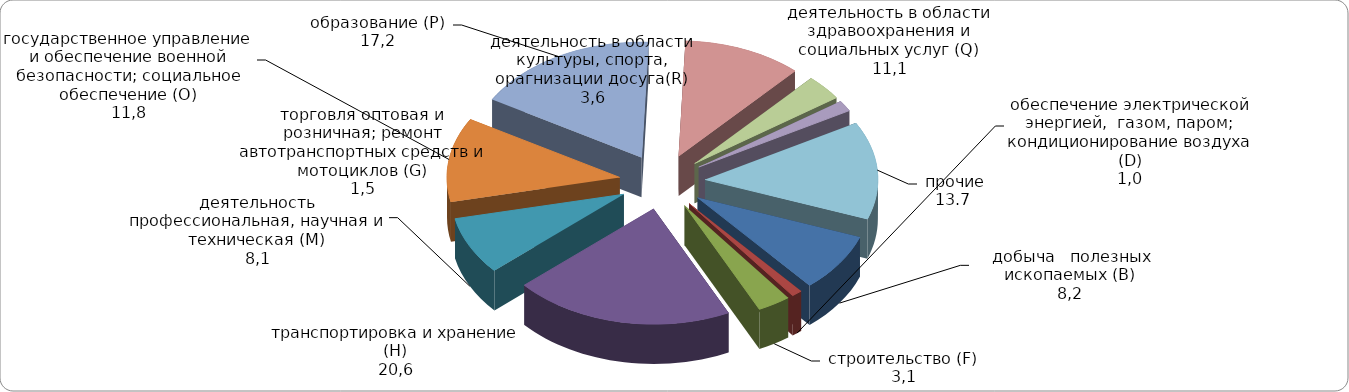
| Category | Series 0 |
|---|---|
|     добыча   полезных    ископаемых (В) | 8.214 |
| обеспечение электрической энергией,  газом, паром; кондиционирование воздуха (D) | 0.994 |
| строительство (F) | 3.102 |
| транспортировка и хранение (H) | 20.598 |
| деятельность профессиональная, научная и техническая (М) | 8.109 |
| государственное управление и обеспечение военной безопасности; социальное обеспечение (О) | 11.786 |
| образование (Р) | 17.242 |
| деятельность в области здравоохранения и социальных услуг (Q) | 11.129 |
| деятельность в области культуры, спорта, орагнизации досуга(R) | 3.55 |
| торговля оптовая и розничная; ремонт автотранспортных средств и мотоциклов (G) | 1.532 |
|  прочие | 13.7 |